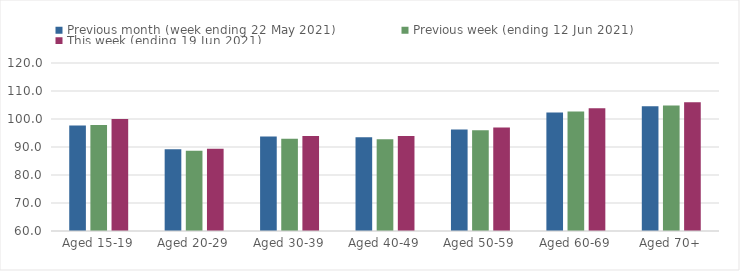
| Category | Previous month (week ending 22 May 2021) | Previous week (ending 12 Jun 2021) | This week (ending 19 Jun 2021) |
|---|---|---|---|
| Aged 15-19 | 97.65 | 97.84 | 99.98 |
| Aged 20-29 | 89.16 | 88.68 | 89.4 |
| Aged 30-39 | 93.78 | 92.97 | 93.9 |
| Aged 40-49 | 93.48 | 92.75 | 93.95 |
| Aged 50-59 | 96.21 | 95.98 | 96.98 |
| Aged 60-69 | 102.36 | 102.66 | 103.84 |
| Aged 70+ | 104.54 | 104.85 | 105.99 |